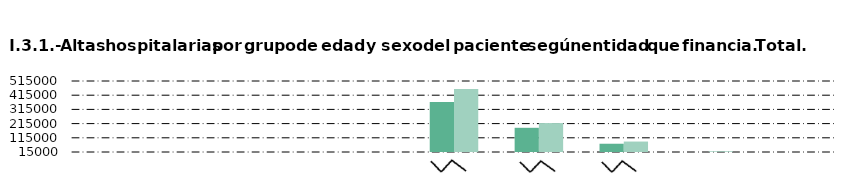
| Category |     Hombre |     Mujer |
|---|---|---|
| Andalucía | 494 | 346 |
| Castilla y León  | 992 | 944 |
| Castilla - La Mancha | 1884 | 3141 |
| Extremadura | 493 | 313 |
| Madrid (Comunidad de) | 366785 | 459484 |
| Resto de CC.AA. | 185405 | 218934 |
| Mutualidades y aseguradoras | 73206 | 88598 |
| Particulares | 13176 | 20101 |
| Otros | 1952 | 3530 |